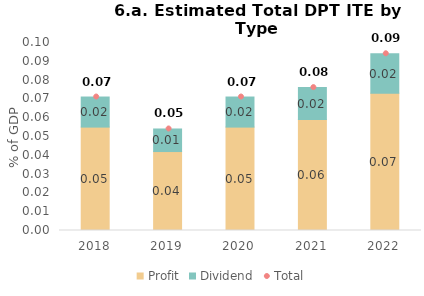
| Category | Profit | Dividend |
|---|---|---|
| 2018.0 | 0.055 | 0.016 |
| 2019.0 | 0.042 | 0.012 |
| 2020.0 | 0.055 | 0.016 |
| 2021.0 | 0.059 | 0.017 |
| 2022.0 | 0.073 | 0.021 |